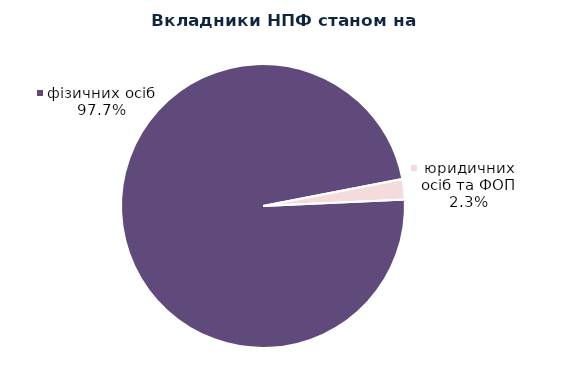
| Category | Series 0 |
|---|---|
| юридичних осіб та ФОП | 1997 |
| фізичних осіб | 84121 |